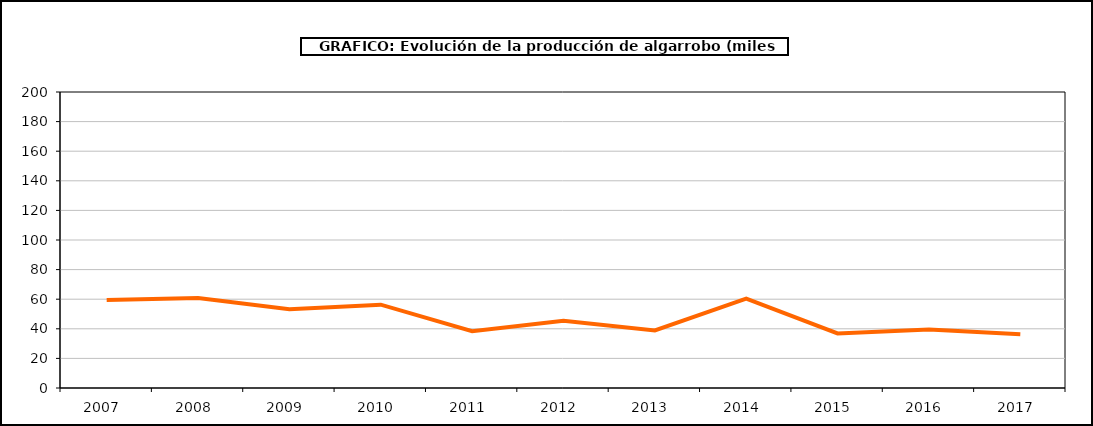
| Category | producción |
|---|---|
| 2007.0 | 59.449 |
| 2008.0 | 60.795 |
| 2009.0 | 53.202 |
| 2010.0 | 56.286 |
| 2011.0 | 38.38 |
| 2012.0 | 45.414 |
| 2013.0 | 38.882 |
| 2014.0 | 60.4 |
| 2015.0 | 36.894 |
| 2016.0 | 39.587 |
| 2017.0 | 36.368 |